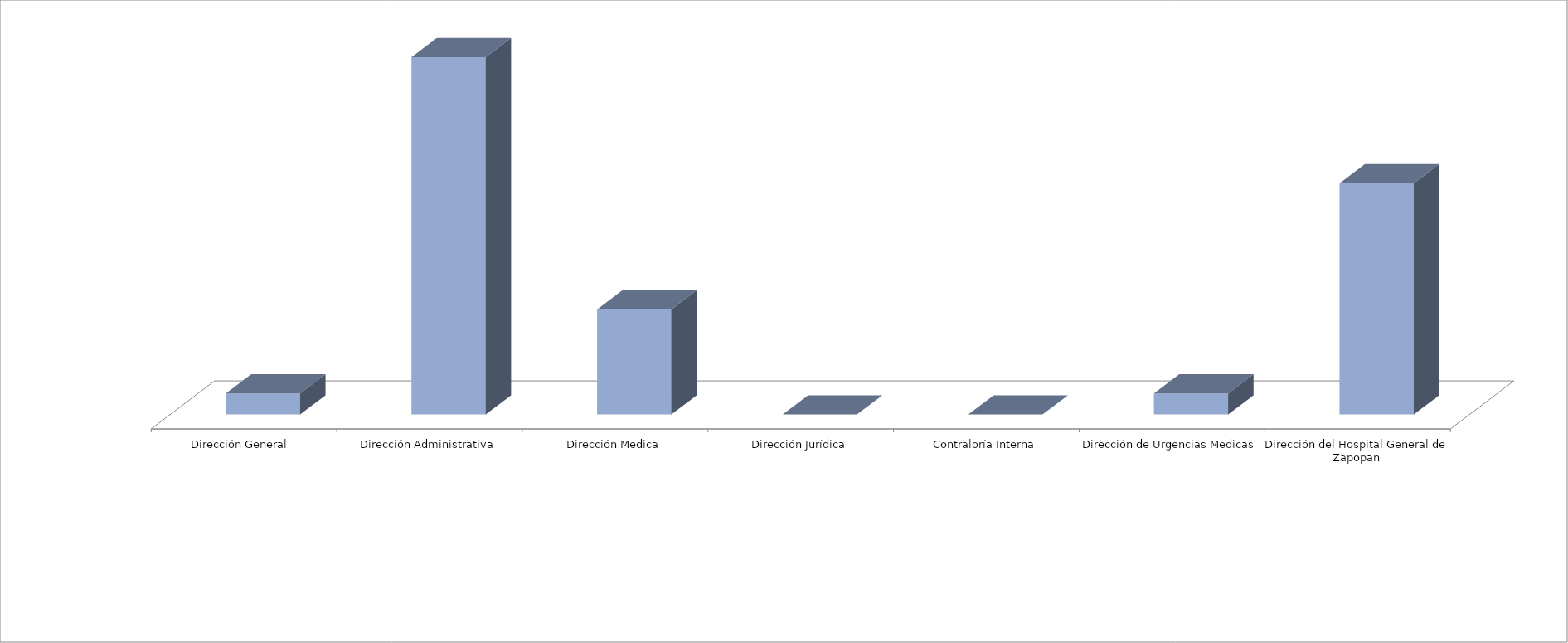
| Category | Series 0 | Series 1 |
|---|---|---|
| Dirección General  |  | 1 |
| Dirección Administrativa |  | 17 |
| Dirección Medica |  | 5 |
| Dirección Jurídica |  | 0 |
| Contraloría Interna |  | 0 |
| Dirección de Urgencias Medicas |  | 1 |
| Dirección del Hospital General de Zapopan |  | 11 |